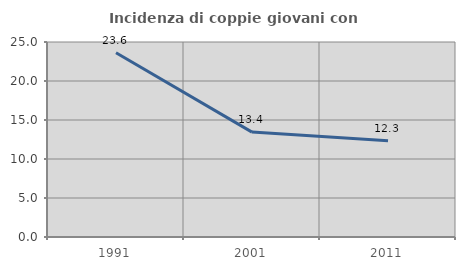
| Category | Incidenza di coppie giovani con figli |
|---|---|
| 1991.0 | 23.629 |
| 2001.0 | 13.447 |
| 2011.0 | 12.339 |